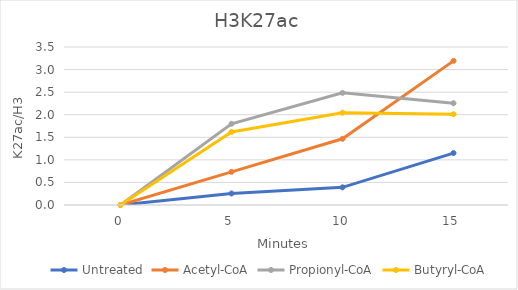
| Category | Untreated | Acetyl-CoA | Propionyl-CoA | Butyryl-CoA |
|---|---|---|---|---|
| 0.0 | 0 | 0 | 0 | 0 |
| 5.0 | 0.255 | 0.735 | 1.799 | 1.618 |
| 10.0 | 0.391 | 1.467 | 2.484 | 2.045 |
| 15.0 | 1.151 | 3.193 | 2.255 | 2.011 |